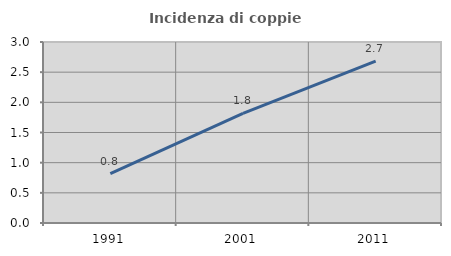
| Category | Incidenza di coppie miste |
|---|---|
| 1991.0 | 0.82 |
| 2001.0 | 1.818 |
| 2011.0 | 2.681 |